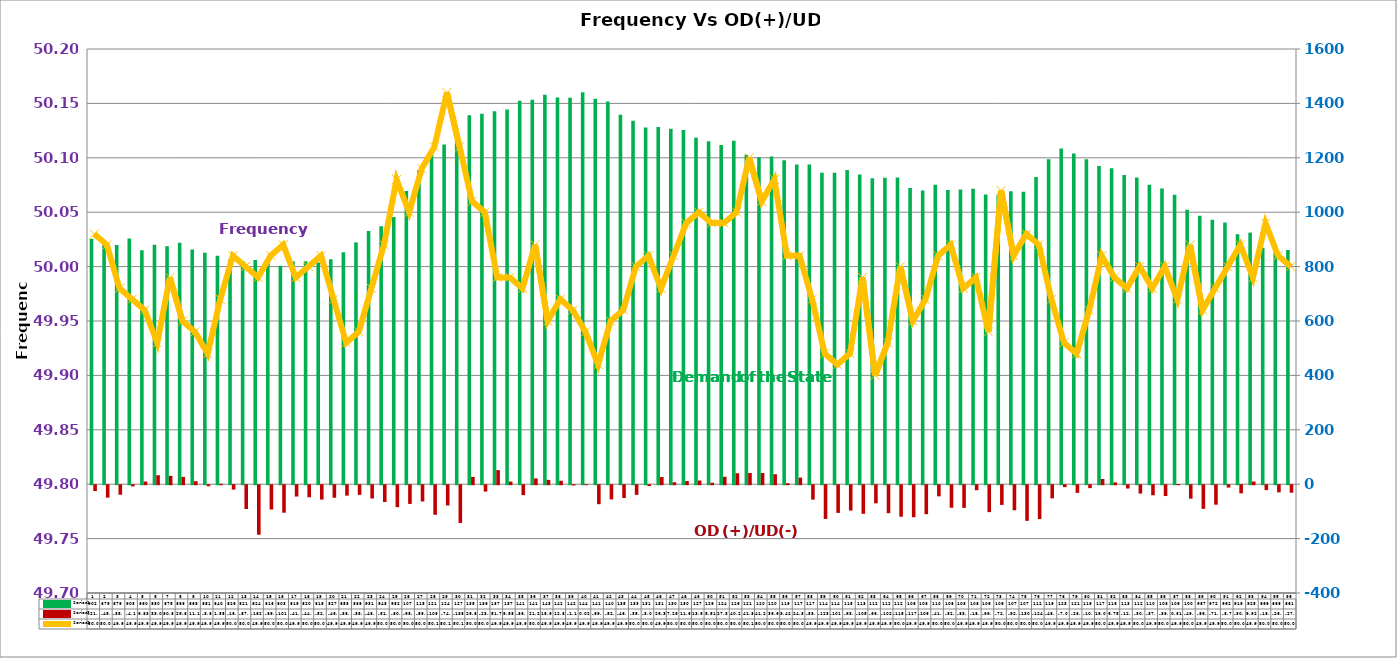
| Category | Series 2 | Series 4 |
|---|---|---|
| 0 | 902 | -21.549 |
| 1 | 879 | -45.685 |
| 2 | 879 | -35.117 |
| 3 | 902.867 | -4.117 |
| 4 | 860.133 | 9.832 |
| 5 | 880 | 33.056 |
| 6 | 875 | 30.801 |
| 7 | 888 | 26.845 |
| 8 | 863 | 11.152 |
| 9 | 851 | -3.848 |
| 10 | 840 | 1.546 |
| 11 | 826 | -16.088 |
| 12 | 821 | -87.573 |
| 13 | 824 | -182.07 |
| 14 | 816 | -89.325 |
| 15 | 803 | -101.228 |
| 16 | 819 | -41.659 |
| 17 | 820 | -44.255 |
| 18 | 815 | -52.852 |
| 19 | 827 | -46.106 |
| 20 | 853 | -38.318 |
| 21 | 889 | -35.564 |
| 22 | 931 | -48.826 |
| 23 | 948 | -61.865 |
| 24 | 982 | -80.81 |
| 25 | 1078 | -68.897 |
| 26 | 1155 | -59.854 |
| 27 | 1211 | -108.684 |
| 28 | 1249 | -74.454 |
| 29 | 1274 | -138.817 |
| 30 | 1356 | 26.851 |
| 31 | 1362 | -23.299 |
| 32 | 1371 | 51.789 |
| 33 | 1378 | 9.582 |
| 34 | 1410 | -36.423 |
| 35 | 1413 | 21.277 |
| 36 | 1432 | 15.927 |
| 37 | 1422 | 12.808 |
| 38 | 1421 | -1.167 |
| 39 | 1441 | 0.016 |
| 40 | 1417 | -69.869 |
| 41 | 1407 | -52.312 |
| 42 | 1358 | -46.96 |
| 43 | 1336 | -35.48 |
| 44 | 1311 | -3.061 |
| 45 | 1313 | 26.322 |
| 46 | 1307 | 7.256 |
| 47 | 1302 | 11.675 |
| 48 | 1274 | 13.614 |
| 49 | 1261 | 5.507 |
| 50 | 1247 | 27.345 |
| 51 | 1263 | 40.227 |
| 52 | 1211 | 41.309 |
| 53 | 1203 | 41.28 |
| 54 | 1205 | 36.614 |
| 55 | 1191 | 3.424 |
| 56 | 1175 | 24.296 |
| 57 | 1175 | -53.071 |
| 58 | 1145 | -123.919 |
| 59 | 1145 | -101.799 |
| 60 | 1155 | -93.096 |
| 61 | 1139 | -105.068 |
| 62 | 1125 | -66.57 |
| 63 | 1127 | -102.858 |
| 64 | 1128 | -115.795 |
| 65 | 1089 | -117.762 |
| 66 | 1080 | -106.623 |
| 67 | 1101 | -41.017 |
| 68 | 1082 | -82.913 |
| 69 | 1083 | -83.293 |
| 70 | 1086 | -18.56 |
| 71 | 1065 | -98.996 |
| 72 | 1062 | -72.495 |
| 73 | 1077 | -92.152 |
| 74 | 1075 | -130.992 |
| 75 | 1129 | -124.266 |
| 76 | 1195 | -48.49 |
| 77 | 1234 | -7.092 |
| 78 | 1216 | -28.129 |
| 79 | 1195 | -10.849 |
| 80 | 1170 | 19.091 |
| 81 | 1162 | 6.754 |
| 82 | 1137 | -12.239 |
| 83 | 1128 | -30.827 |
| 84 | 1101 | -37.007 |
| 85 | 1087 | -39.906 |
| 86 | 1064 | 0.813 |
| 87 | 1009 | -49.587 |
| 88 | 987 | -86.83 |
| 89 | 972 | -71.63 |
| 90 | 962 | -8.703 |
| 91 | 919 | -30.102 |
| 92 | 925 | 9.917 |
| 93 | 869 | -18.083 |
| 94 | 868 | -26.311 |
| 95 | 861 | -27.576 |